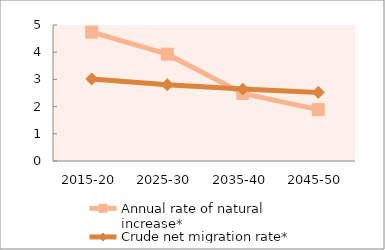
| Category | Annual rate of natural increase* | Crude net migration rate* |
|---|---|---|
| 2015-20 | 4.739 | 3.016 |
| 2025-30 | 3.928 | 2.804 |
| 2035-40 | 2.483 | 2.643 |
| 2045-50 | 1.887 | 2.522 |